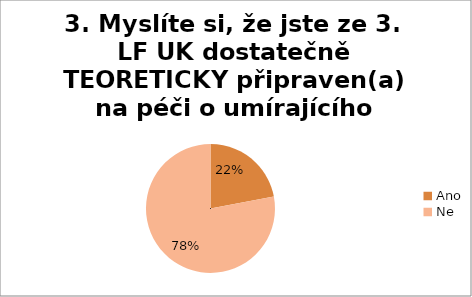
| Category | 3. Myslíte si, že jste ze 3. LF UK dostatečně TEORETICKY připraven(a) na péči o umírajícího pacienta?  |
|---|---|
| Ano | 0.22 |
| Ne | 0.78 |